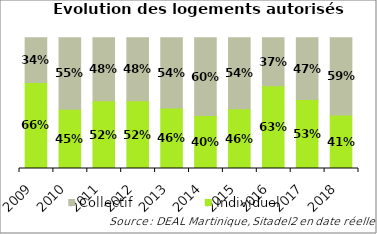
| Category | Individuel | Collectif |
|---|---|---|
| 2009.0 | 0.658 | 0.342 |
| 2010.0 | 0.452 | 0.548 |
| 2011.0 | 0.518 | 0.482 |
| 2012.0 | 0.519 | 0.481 |
| 2013.0 | 0.463 | 0.537 |
| 2014.0 | 0.404 | 0.596 |
| 2015.0 | 0.457 | 0.543 |
| 2016.0 | 0.633 | 0.367 |
| 2017.0 | 0.528 | 0.472 |
| 2018.0 | 0.41 | 0.59 |